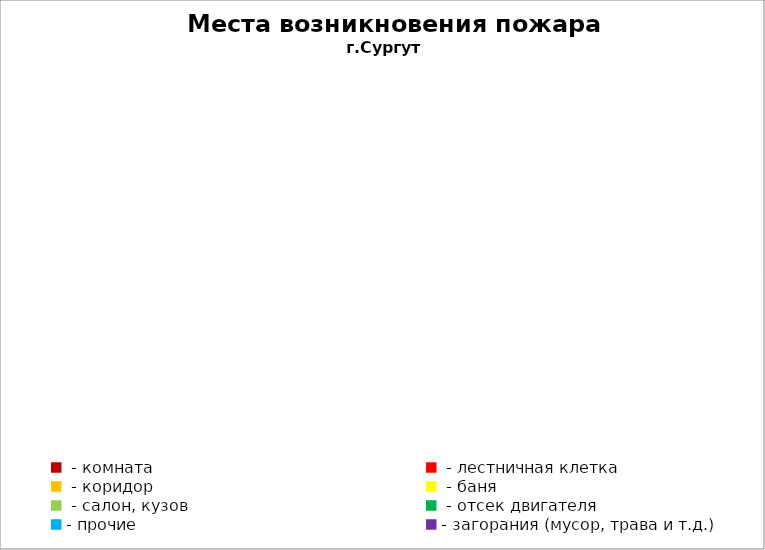
| Category | Места возникновения пожара |
|---|---|
|  - комната | 76 |
|  - лестничная клетка | 36 |
|  - коридор | 5 |
|  - баня | 61 |
|  - салон, кузов | 31 |
|  - отсек двигателя | 30 |
| - прочие | 131 |
| - загорания (мусор, трава и т.д.)  | 190 |